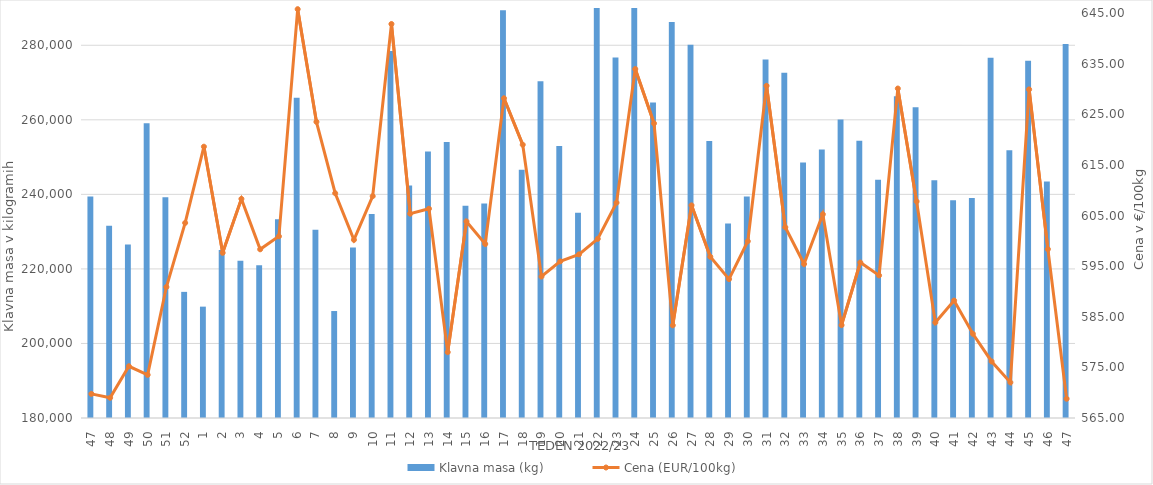
| Category | Klavna masa (kg) |
|---|---|
| 47.0 | 239417 |
| 48.0 | 231565 |
| 49.0 | 226575 |
| 50.0 | 259073 |
| 51.0 | 239211 |
| 52.0 | 213841 |
| 1.0 | 209877 |
| 2.0 | 225045 |
| 3.0 | 222198 |
| 4.0 | 221002 |
| 5.0 | 233306 |
| 6.0 | 265944 |
| 7.0 | 230531 |
| 8.0 | 208699 |
| 9.0 | 225712 |
| 10.0 | 234762 |
| 11.0 | 278467 |
| 12.0 | 242369 |
| 13.0 | 251507 |
| 14.0 | 254072 |
| 15.0 | 236964 |
| 16.0 | 237552 |
| 17.0 | 289400 |
| 18.0 | 246616 |
| 19.0 | 270374 |
| 20.0 | 252984 |
| 21.0 | 235060 |
| 22.0 | 290816 |
| 23.0 | 276702 |
| 24.0 | 292976 |
| 25.0 | 264669 |
| 26.0 | 286237 |
| 27.0 | 280112 |
| 28.0 | 254336 |
| 29.0 | 232178 |
| 30.0 | 239437 |
| 31.0 | 276163 |
| 32.0 | 272647 |
| 33.0 | 248536 |
| 34.0 | 252050 |
| 35.0 | 260110 |
| 36.0 | 254389 |
| 37.0 | 243933 |
| 38.0 | 266321 |
| 39.0 | 263346 |
| 40.0 | 243765 |
| 41.0 | 238404 |
| 42.0 | 239007 |
| 43.0 | 276684 |
| 44.0 | 251832 |
| 45.0 | 275816 |
| 46.0 | 243425 |
| 47.0 | 280350 |